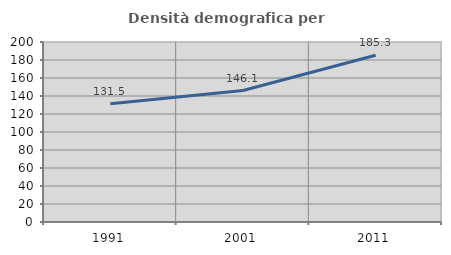
| Category | Densità demografica |
|---|---|
| 1991.0 | 131.503 |
| 2001.0 | 146.09 |
| 2011.0 | 185.337 |